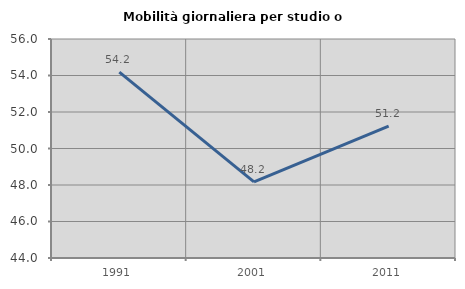
| Category | Mobilità giornaliera per studio o lavoro |
|---|---|
| 1991.0 | 54.188 |
| 2001.0 | 48.174 |
| 2011.0 | 51.225 |